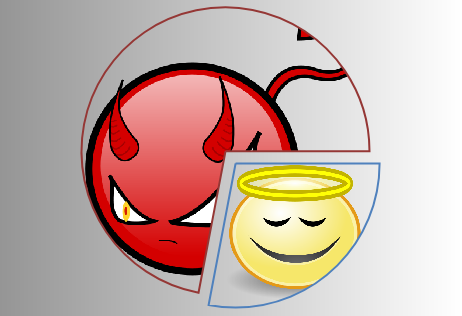
| Category | Series 0 |
|---|---|
| buenos | 0.28 |
| spammers | 0.72 |